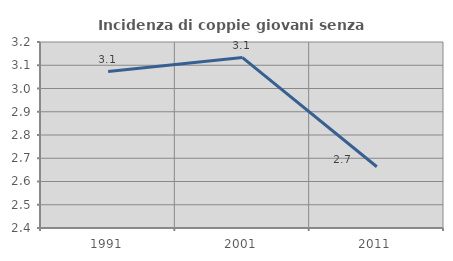
| Category | Incidenza di coppie giovani senza figli |
|---|---|
| 1991.0 | 3.073 |
| 2001.0 | 3.133 |
| 2011.0 | 2.663 |